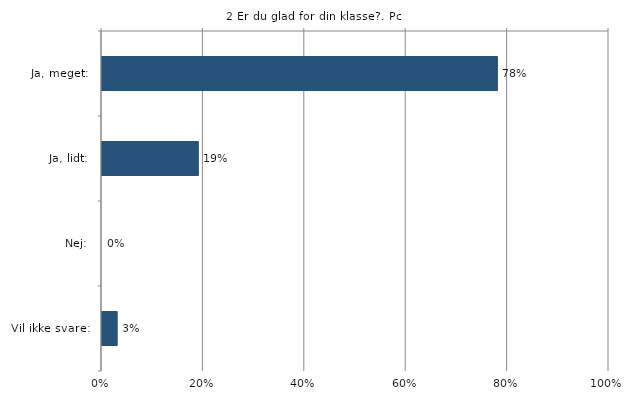
| Category | Er du glad for din klasse? |
|---|---|
| Ja, meget:  | 0.78 |
| Ja, lidt:  | 0.19 |
| Nej:  | 0 |
| Vil ikke svare:  | 0.03 |